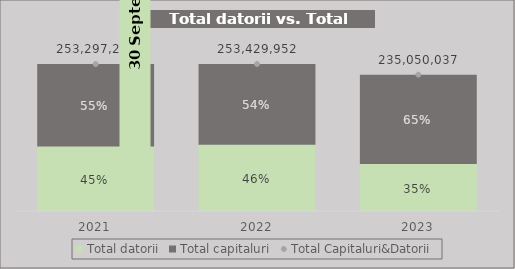
| Category | Total datorii | Total capitaluri |
|---|---|---|
| 2021.0 | 113056362 | 140240889 |
| 2022.0 | 115866849 | 137563103 |
| 2023.0 | 82751626 | 152298411 |